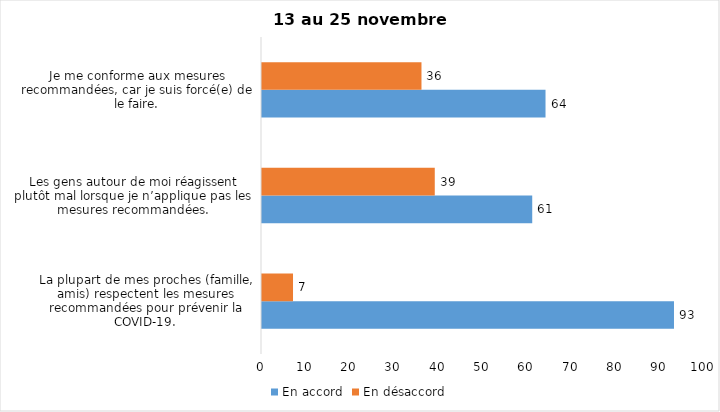
| Category | En accord | En désaccord |
|---|---|---|
| La plupart de mes proches (famille, amis) respectent les mesures recommandées pour prévenir la COVID-19. | 93 | 7 |
| Les gens autour de moi réagissent plutôt mal lorsque je n’applique pas les mesures recommandées. | 61 | 39 |
| Je me conforme aux mesures recommandées, car je suis forcé(e) de le faire. | 64 | 36 |